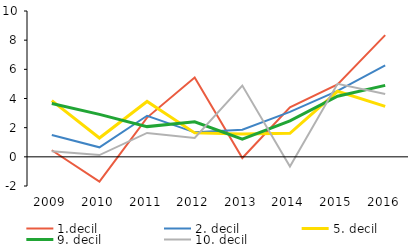
| Category | 1.decil | 2. decil | 5. decil | 9. decil | 10. decil |
|---|---|---|---|---|---|
| 2009.0 | 0.451 | 1.502 | 3.851 | 3.66 | 0.381 |
| 2010.0 | -1.703 | 0.653 | 1.289 | 2.911 | 0.121 |
| 2011.0 | 2.692 | 2.818 | 3.797 | 2.072 | 1.639 |
| 2012.0 | 5.437 | 1.679 | 1.642 | 2.407 | 1.29 |
| 2013.0 | -0.079 | 1.854 | 1.569 | 1.22 | 4.883 |
| 2014.0 | 3.388 | 3.082 | 1.61 | 2.472 | -0.666 |
| 2015.0 | 4.972 | 4.519 | 4.496 | 4.152 | 5.006 |
| 2016.0 | 8.348 | 6.271 | 3.459 | 4.898 | 4.309 |